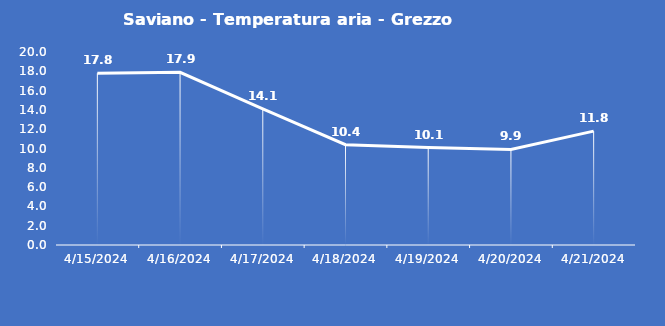
| Category | Saviano - Temperatura aria - Grezzo (°C) |
|---|---|
| 4/15/24 | 17.8 |
| 4/16/24 | 17.9 |
| 4/17/24 | 14.1 |
| 4/18/24 | 10.4 |
| 4/19/24 | 10.1 |
| 4/20/24 | 9.9 |
| 4/21/24 | 11.8 |